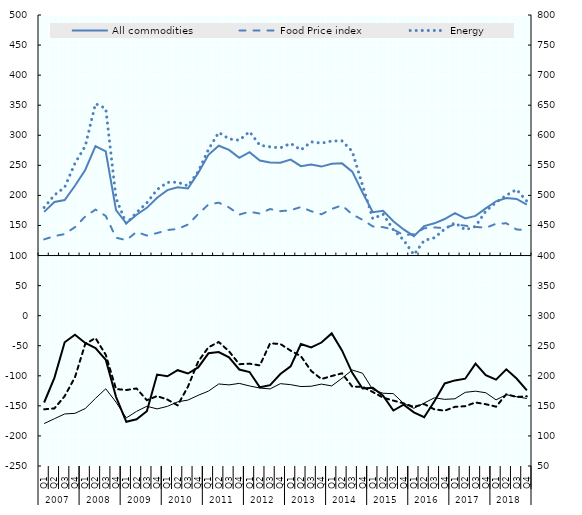
| Category | All commodities | Food Price index | Energy |
|---|---|---|---|
| 0 | 172.637 | 126.865 | 179.931 |
| 1 | 189.041 | 132.387 | 200.485 |
| 2 | 192.222 | 135.673 | 213.504 |
| 3 | 216.015 | 147.187 | 253.33 |
| 4 | 242.207 | 164.863 | 281.823 |
| 5 | 281.901 | 176.413 | 352.505 |
| 6 | 273.028 | 165.849 | 344.561 |
| 7 | 175.497 | 129.699 | 195.268 |
| 8 | 153.499 | 125.494 | 153.085 |
| 9 | 167.939 | 139.349 | 171.468 |
| 10 | 179.307 | 133.152 | 187.605 |
| 11 | 196.122 | 137.347 | 209.649 |
| 12 | 208.731 | 142.427 | 221.655 |
| 13 | 213.389 | 144.145 | 221.955 |
| 14 | 211.516 | 151.524 | 215.831 |
| 15 | 237.374 | 168.889 | 239.552 |
| 16 | 267.441 | 184.914 | 276.511 |
| 17 | 282.576 | 187.933 | 304.726 |
| 18 | 275.647 | 179.937 | 293.984 |
| 19 | 262.354 | 168.095 | 291.717 |
| 20 | 271.993 | 172.823 | 306.038 |
| 21 | 257.899 | 169.788 | 283.345 |
| 22 | 254.658 | 177.328 | 280.734 |
| 23 | 254.444 | 173.779 | 279.056 |
| 24 | 259.582 | 175.374 | 286.367 |
| 25 | 248.649 | 180.671 | 275.59 |
| 26 | 251.301 | 173.696 | 289.052 |
| 27 | 247.902 | 168.535 | 286.852 |
| 28 | 252.514 | 177.491 | 290.445 |
| 29 | 253.291 | 183.456 | 290.613 |
| 30 | 239.533 | 168.335 | 273.18 |
| 31 | 204.904 | 159.478 | 216.72 |
| 32 | 172.2 | 148.43 | 161.238 |
| 33 | 174.577 | 147.199 | 168.764 |
| 34 | 157.053 | 143.353 | 142.995 |
| 35 | 143.406 | 134.078 | 125.7 |
| 36 | 132.221 | 135.383 | 101.324 |
| 37 | 149.05 | 145.337 | 125.052 |
| 38 | 153.542 | 146.781 | 129.581 |
| 39 | 160.701 | 145.531 | 144.138 |
| 40 | 170.459 | 151.953 | 154.468 |
| 41 | 161.611 | 149.589 | 142.777 |
| 42 | 165.885 | 147.671 | 148.592 |
| 43 | 178.354 | 146.123 | 173.898 |
| 44 | 190.19 | 152.801 | 188.512 |
| 45 | 195.501 | 153.652 | 200.143 |
| 46 | 194.159 | 143.271 | 209.741 |
| 47 | 184.519 | 142.31 | 190.226 |